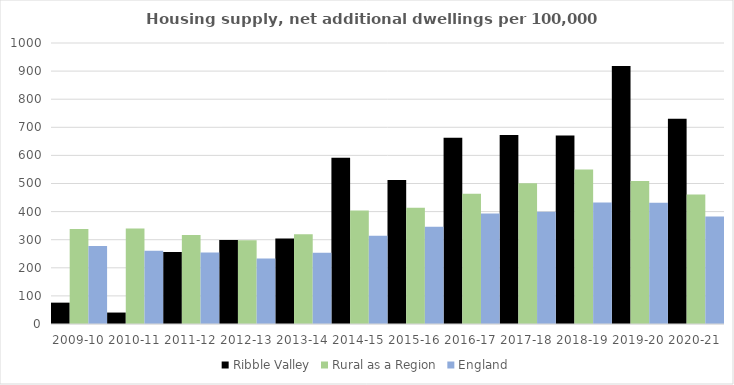
| Category | Ribble Valley | Rural as a Region | England |
|---|---|---|---|
| 2009-10 | 75.984 | 337.852 | 277.548 |
| 2010-11 | 40.746 | 340.105 | 260.994 |
| 2011-12 | 256.58 | 317.04 | 254.007 |
| 2012-13 | 298.58 | 297.763 | 233.153 |
| 2013-14 | 304.088 | 319.835 | 253.602 |
| 2014-15 | 592.032 | 403.796 | 314.256 |
| 2015-16 | 512.654 | 414.091 | 346.154 |
| 2016-17 | 662.544 | 463.209 | 393.256 |
| 2017-18 | 672.224 | 500.68 | 399.646 |
| 2018-19 | 671.029 | 549.491 | 432.099 |
| 2019-20 | 918.079 | 508.493 | 431.187 |
| 2020-21 | 730.339 | 461.114 | 382.827 |